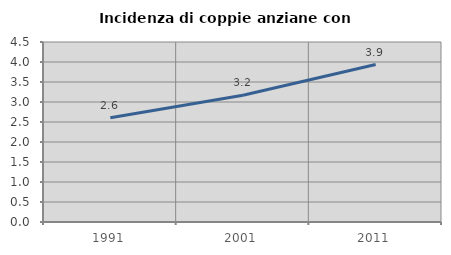
| Category | Incidenza di coppie anziane con figli |
|---|---|
| 1991.0 | 2.605 |
| 2001.0 | 3.168 |
| 2011.0 | 3.937 |